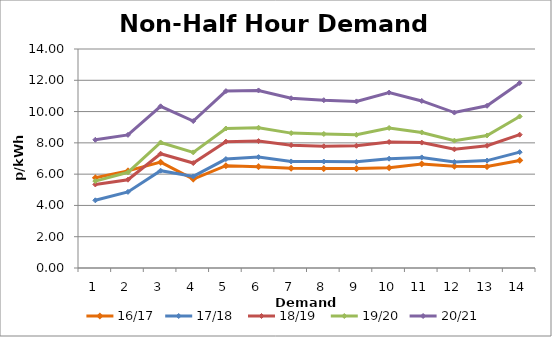
| Category | 16/17 | 17/18  | 18/19  | 19/20 | 20/21  |
|---|---|---|---|---|---|
| 1.0 | 5.768 | 4.327 | 5.342 | 5.557 | 8.195 |
| 2.0 | 6.207 | 4.866 | 5.644 | 6.117 | 8.511 |
| 3.0 | 6.766 | 6.221 | 7.306 | 8.025 | 10.335 |
| 4.0 | 5.688 | 5.853 | 6.71 | 7.391 | 9.395 |
| 5.0 | 6.543 | 6.962 | 8.078 | 8.918 | 11.308 |
| 6.0 | 6.479 | 7.088 | 8.115 | 8.966 | 11.351 |
| 7.0 | 6.375 | 6.812 | 7.855 | 8.623 | 10.852 |
| 8.0 | 6.354 | 6.806 | 7.781 | 8.569 | 10.727 |
| 9.0 | 6.353 | 6.786 | 7.815 | 8.516 | 10.65 |
| 10.0 | 6.403 | 6.99 | 8.056 | 8.952 | 11.213 |
| 11.0 | 6.653 | 7.07 | 8.015 | 8.665 | 10.679 |
| 12.0 | 6.508 | 6.779 | 7.586 | 8.143 | 9.937 |
| 13.0 | 6.485 | 6.866 | 7.817 | 8.473 | 10.371 |
| 14.0 | 6.878 | 7.405 | 8.523 | 9.689 | 11.828 |